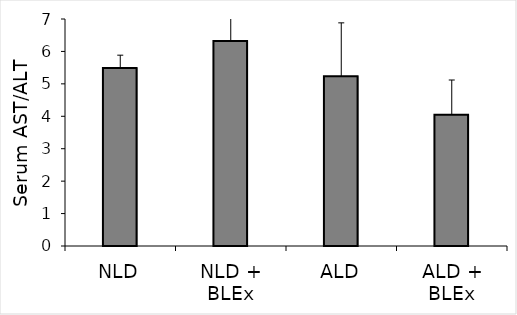
| Category | Series 0 |
|---|---|
| NLD | 5.488 |
| NLD + BLEx | 6.325 |
| ALD | 5.238 |
| ALD + BLEx | 4.05 |